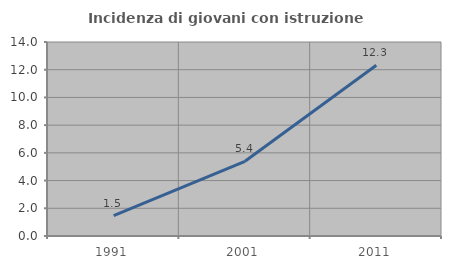
| Category | Incidenza di giovani con istruzione universitaria |
|---|---|
| 1991.0 | 1.465 |
| 2001.0 | 5.391 |
| 2011.0 | 12.321 |